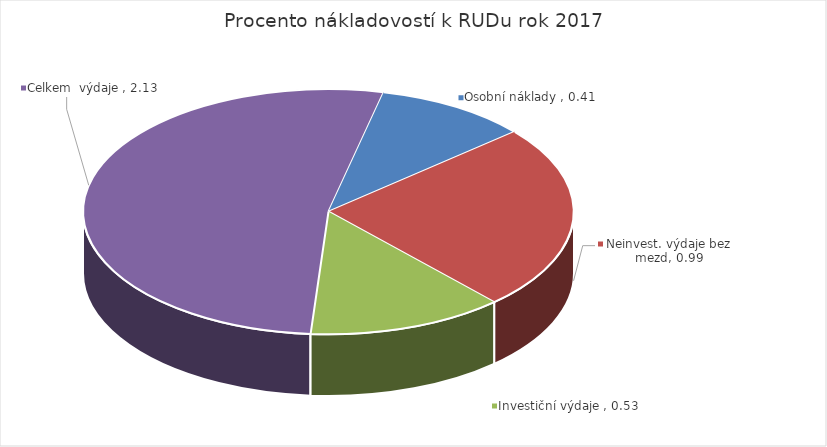
| Category | Series 0 |
|---|---|
| Osobní náklady  | 0.41 |
| Neinvest. výdaje bez mezd | 0.994 |
| Investiční výdaje  | 0.525 |
| Celkem  výdaje  | 2.128 |